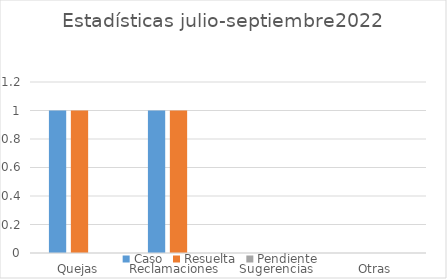
| Category | Caso | Resuelta | Pendiente |
|---|---|---|---|
| Quejas | 1 | 1 | 0 |
| Reclamaciones  | 1 | 1 | 0 |
| Sugerencias | 0 | 0 | 0 |
| Otras | 0 | 0 | 0 |